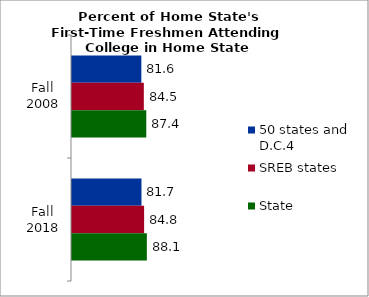
| Category | 50 states and D.C.4 | SREB states | State |
|---|---|---|---|
| Fall 2008 | 81.592 | 84.505 | 87.387 |
| Fall 2018 | 81.735 | 84.835 | 88.068 |